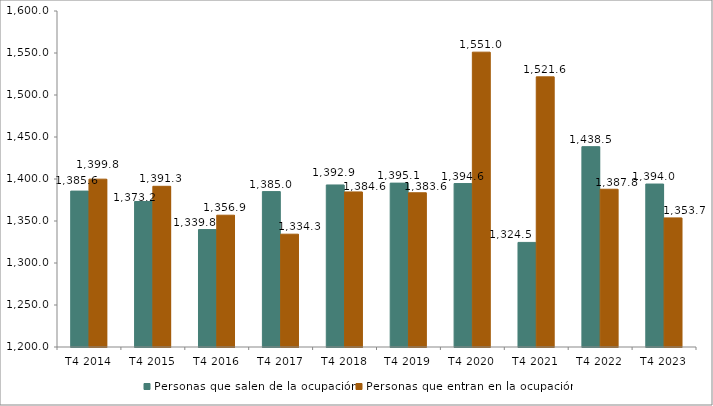
| Category | Personas que salen de la ocupación | Personas que entran en la ocupación |
|---|---|---|
| T4 2014 | 1385.6 | 1399.8 |
| T4 2015 | 1373.2 | 1391.3 |
| T4 2016 | 1339.8 | 1356.9 |
| T4 2017 | 1385 | 1334.3 |
| T4 2018 | 1392.9 | 1384.6 |
| T4 2019 | 1395.1 | 1383.6 |
| T4 2020 | 1394.6 | 1551 |
| T4 2021 | 1324.5 | 1521.6 |
| T4 2022 | 1438.5 | 1387.8 |
| T4 2023 | 1394 | 1353.7 |